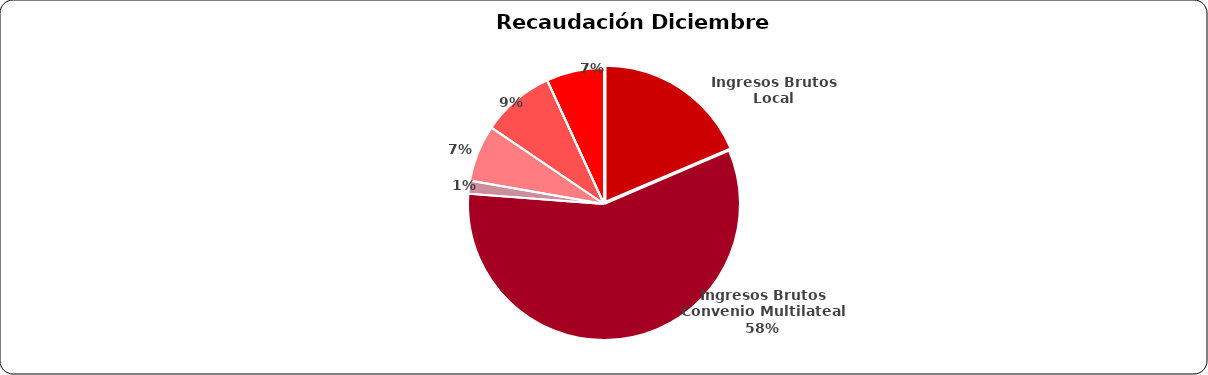
| Category | Recaudación
Diciembre 2023 |
|---|---|
| 0 | 1838956897.38 |
| 1 | 5703636155.7 |
| 2 | 153200094.79 |
| 3 | 666259490.21 |
| 4 | 856772339.58 |
| 5 | 189351.27 |
| 6 | 678541612.41 |